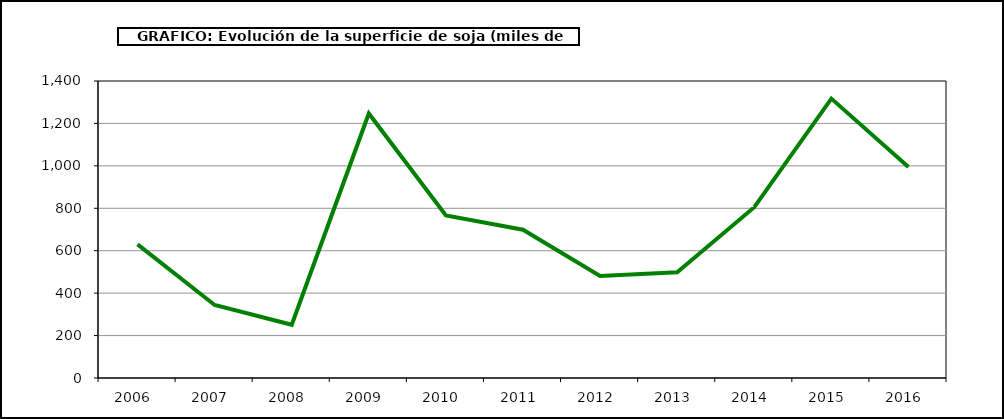
| Category | Superficie |
|---|---|
| 2006.0 | 630 |
| 2007.0 | 344 |
| 2008.0 | 251 |
| 2009.0 | 1247 |
| 2010.0 | 766 |
| 2011.0 | 699 |
| 2012.0 | 481 |
| 2013.0 | 498 |
| 2014.0 | 805 |
| 2015.0 | 1317 |
| 2016.0 | 995 |